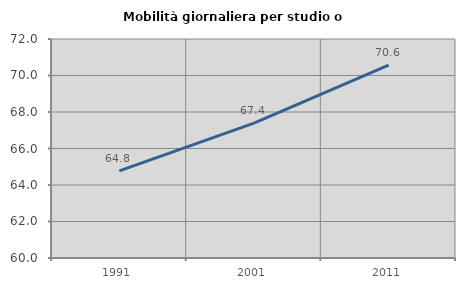
| Category | Mobilità giornaliera per studio o lavoro |
|---|---|
| 1991.0 | 64.77 |
| 2001.0 | 67.388 |
| 2011.0 | 70.573 |